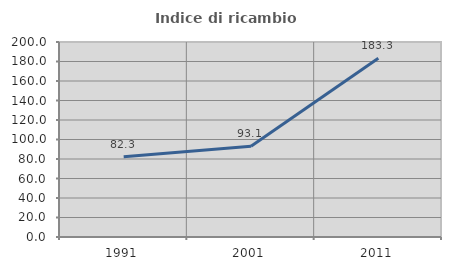
| Category | Indice di ricambio occupazionale  |
|---|---|
| 1991.0 | 82.337 |
| 2001.0 | 93.143 |
| 2011.0 | 183.275 |